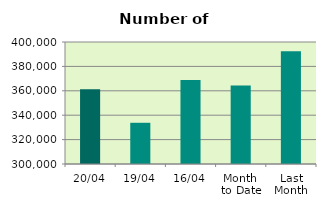
| Category | Series 0 |
|---|---|
| 20/04 | 361182 |
| 19/04 | 333790 |
| 16/04 | 368820 |
| Month 
to Date | 364268 |
| Last
Month | 392496.174 |